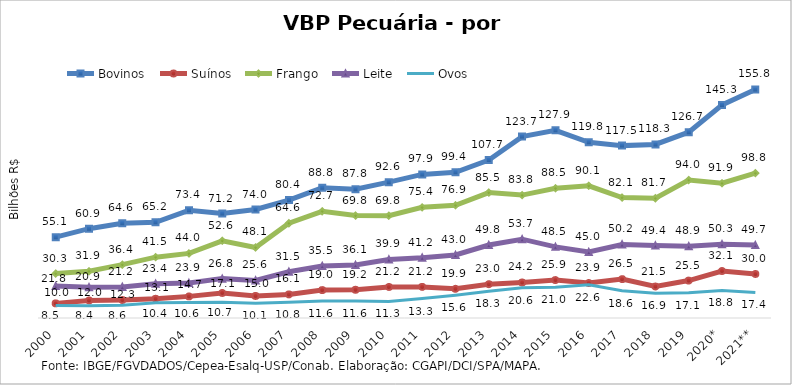
| Category | Bovinos | Suínos | Frango | Leite | Ovos |
|---|---|---|---|---|---|
| 2000 | 55.094 | 9.976 | 30.316 | 21.762 | 8.509 |
| 2001 | 60.901 | 11.968 | 31.864 | 20.941 | 8.385 |
| 2002 | 64.628 | 12.266 | 36.372 | 21.204 | 8.638 |
| 2003 | 65.226 | 13.109 | 41.467 | 23.35 | 10.449 |
| 2004 | 73.387 | 14.739 | 44.032 | 23.865 | 10.59 |
| 2005 | 71.249 | 17.089 | 52.644 | 26.842 | 10.662 |
| 2006 | 73.974 | 15.032 | 48.092 | 25.638 | 10.128 |
| 2007 | 80.392 | 16.074 | 64.617 | 31.519 | 10.764 |
| 2008 | 88.762 | 19.033 | 72.738 | 35.457 | 11.625 |
| 2009 | 87.837 | 19.239 | 69.838 | 36.148 | 11.591 |
| 2010 | 92.606 | 21.165 | 69.754 | 39.921 | 11.274 |
| 2011 | 97.899 | 21.198 | 75.442 | 41.154 | 13.284 |
| 2012 | 99.359 | 19.904 | 76.85 | 43.004 | 15.572 |
| 2013 | 107.669 | 23.046 | 85.535 | 49.764 | 18.315 |
| 2014 | 123.693 | 24.206 | 83.805 | 53.739 | 20.578 |
| 2015 | 127.95 | 25.869 | 88.472 | 48.508 | 20.952 |
| 2016 | 119.767 | 23.873 | 90.147 | 45.01 | 22.588 |
| 2017 | 117.531 | 26.501 | 82.108 | 50.151 | 18.618 |
| 2018 | 118.318 | 21.462 | 81.661 | 49.405 | 16.93 |
| 2019 | 126.693 | 25.51 | 94.024 | 48.947 | 17.146 |
| 2020* | 145.26 | 32.054 | 91.865 | 50.271 | 18.794 |
| 2021** | 155.813 | 30.01 | 98.773 | 49.738 | 17.389 |